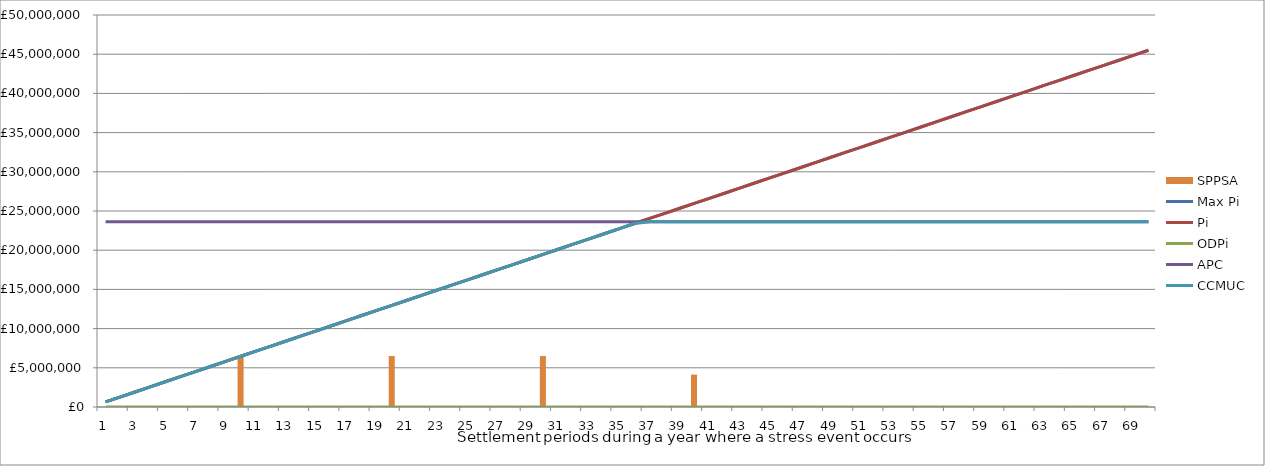
| Category | SPPSA |
|---|---|
| 0 | 0 |
| 1 | 0 |
| 2 | 0 |
| 3 | 0 |
| 4 | 0 |
| 5 | 0 |
| 6 | 0 |
| 7 | 0 |
| 8 | 0 |
| 9 | 6500000 |
| 10 | 0 |
| 11 | 0 |
| 12 | 0 |
| 13 | 0 |
| 14 | 0 |
| 15 | 0 |
| 16 | 0 |
| 17 | 0 |
| 18 | 0 |
| 19 | 6500000 |
| 20 | 0 |
| 21 | 0 |
| 22 | 0 |
| 23 | 0 |
| 24 | 0 |
| 25 | 0 |
| 26 | 0 |
| 27 | 0 |
| 28 | 0 |
| 29 | 6500000 |
| 30 | 0 |
| 31 | 0 |
| 32 | 0 |
| 33 | 0 |
| 34 | 0 |
| 35 | 0 |
| 36 | 0 |
| 37 | 0 |
| 38 | 0 |
| 39 | 4134000 |
| 40 | 0 |
| 41 | 0 |
| 42 | 0 |
| 43 | 0 |
| 44 | 0 |
| 45 | 0 |
| 46 | 0 |
| 47 | 0 |
| 48 | 0 |
| 49 | 0 |
| 50 | 0 |
| 51 | 0 |
| 52 | 0 |
| 53 | 0 |
| 54 | 0 |
| 55 | 0 |
| 56 | 0 |
| 57 | 0 |
| 58 | 0 |
| 59 | 0 |
| 60 | 0 |
| 61 | 0 |
| 62 | 0 |
| 63 | 0 |
| 64 | 0 |
| 65 | 0 |
| 66 | 0 |
| 67 | 0 |
| 68 | 0 |
| 69 | 0 |